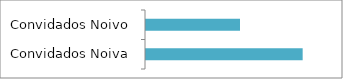
| Category | Series 0 |
|---|---|
| Convidados Noiva | 5 |
| Convidados Noivo | 3 |